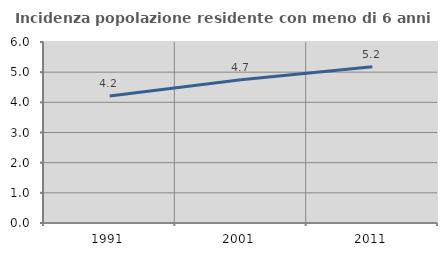
| Category | Incidenza popolazione residente con meno di 6 anni |
|---|---|
| 1991.0 | 4.21 |
| 2001.0 | 4.749 |
| 2011.0 | 5.179 |